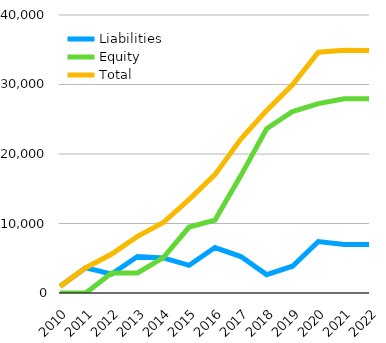
| Category | Liabilities  | Equity  | Total  |
|---|---|---|---|
| 2010 | 948 | 0 | 948 |
| 2011 | 3632 | 10 | 3642 |
| 2012 | 2721 | 2892 | 5613 |
| 2013 | 5257 | 2892 | 8149 |
| 2014 | 5046 | 5092 | 10138 |
| 2015 | 3986 | 9492 | 13478 |
| 2016 | 6544 | 10492 | 17036 |
| 2017 | 5248 | 16892 | 22140 |
| 2018 | 2642 | 23632 | 26274 |
| 2019 | 3849 | 26117 | 29966 |
| 2020 | 7407 | 27247 | 34654 |
| 2021 | 6978 | 27944 | 34922 |
| 2022 | 6961.8 | 27944.03 | 34905.83 |